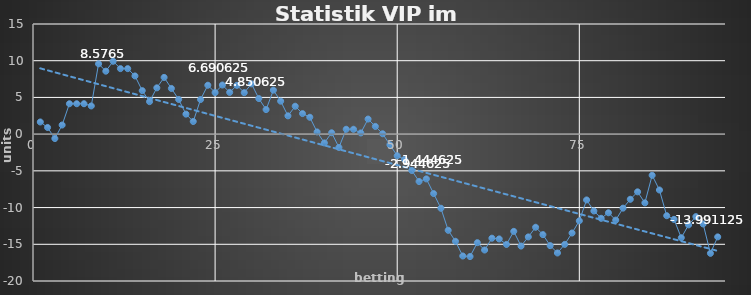
| Category | Series 0 |
|---|---|
| 0 | 1.657 |
| 1 | 0.907 |
| 2 | -0.593 |
| 3 | 1.241 |
| 4 | 4.142 |
| 5 | 4.142 |
| 6 | 4.142 |
| 7 | 3.842 |
| 8 | 9.576 |
| 9 | 8.576 |
| 10 | 9.926 |
| 11 | 8.926 |
| 12 | 8.926 |
| 13 | 7.926 |
| 14 | 5.926 |
| 15 | 4.426 |
| 16 | 6.306 |
| 17 | 7.726 |
| 18 | 6.226 |
| 19 | 4.726 |
| 20 | 2.726 |
| 21 | 1.726 |
| 22 | 4.713 |
| 23 | 6.661 |
| 24 | 5.661 |
| 25 | 6.691 |
| 26 | 5.691 |
| 27 | 6.651 |
| 28 | 5.651 |
| 29 | 6.851 |
| 30 | 4.851 |
| 31 | 3.351 |
| 32 | 5.994 |
| 33 | 4.494 |
| 34 | 2.494 |
| 35 | 3.802 |
| 36 | 2.802 |
| 37 | 2.302 |
| 38 | 0.302 |
| 39 | -1.198 |
| 40 | 0.19 |
| 41 | -1.81 |
| 42 | 0.665 |
| 43 | 0.665 |
| 44 | 0.165 |
| 45 | 2.055 |
| 46 | 1.055 |
| 47 | 0.055 |
| 48 | -1.445 |
| 49 | -2.945 |
| 50 | -3.445 |
| 51 | -4.945 |
| 52 | -6.445 |
| 53 | -6.092 |
| 54 | -8.092 |
| 55 | -10.092 |
| 56 | -13.092 |
| 57 | -14.592 |
| 58 | -16.592 |
| 59 | -16.667 |
| 60 | -14.779 |
| 61 | -15.779 |
| 62 | -14.169 |
| 63 | -14.269 |
| 64 | -15.019 |
| 65 | -13.238 |
| 66 | -15.238 |
| 67 | -13.995 |
| 68 | -12.681 |
| 69 | -13.681 |
| 70 | -15.181 |
| 71 | -16.181 |
| 72 | -15.009 |
| 73 | -13.464 |
| 74 | -11.804 |
| 75 | -8.962 |
| 76 | -10.462 |
| 77 | -11.462 |
| 78 | -10.707 |
| 79 | -11.707 |
| 80 | -10.078 |
| 81 | -8.87 |
| 82 | -7.856 |
| 83 | -9.356 |
| 84 | -5.606 |
| 85 | -7.606 |
| 86 | -11.106 |
| 87 | -11.606 |
| 88 | -14.106 |
| 89 | -12.356 |
| 90 | -11.231 |
| 91 | -12.231 |
| 92 | -16.231 |
| 93 | -13.991 |